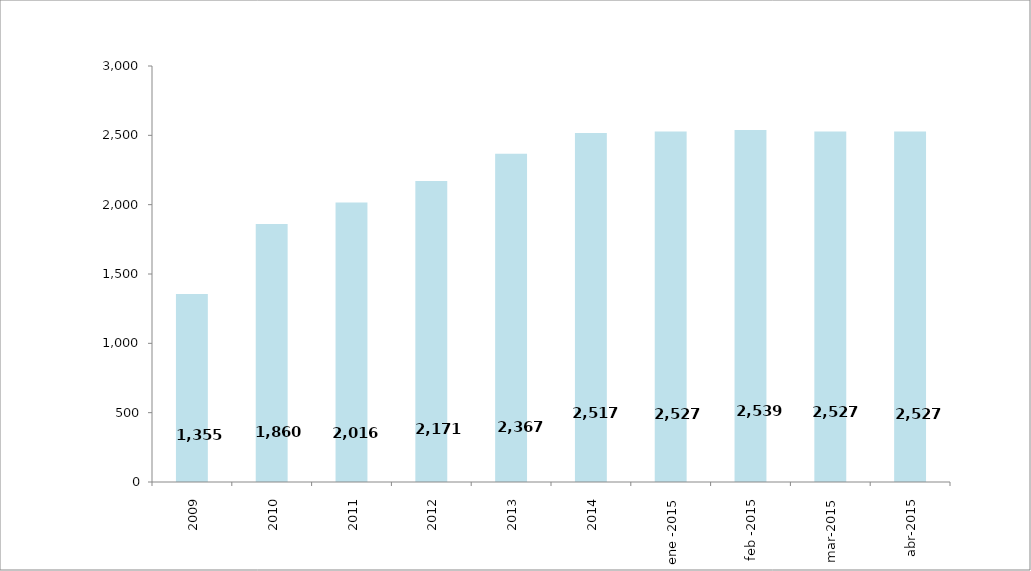
| Category | Series 0 |
|---|---|
| 2009 | 1355 |
| 2010 | 1860 |
| 2011 | 2016 |
| 2012 | 2171 |
| 2013 | 2367 |
| 2014 | 2517 |
| ene -2015 | 2527 |
| feb -2015 | 2539 |
| mar-2015 | 2527 |
| abr-2015 | 2527 |